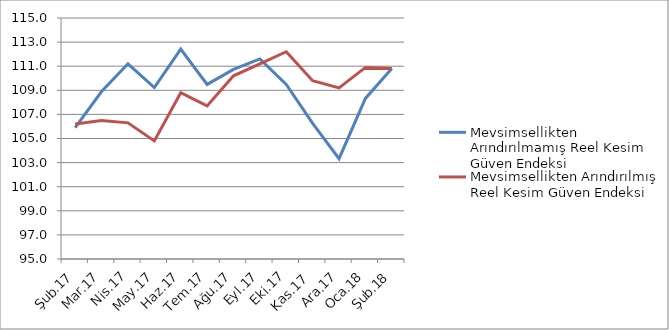
| Category | Mevsimsellikten Arındırılmamış Reel Kesim Güven Endeksi | Mevsimsellikten Arındırılmış Reel Kesim Güven Endeksi |
|---|---|---|
| Şub.17 | 105.9 | 106.2 |
| Mar.17 | 108.9 | 106.5 |
| Nis.17 | 111.2 | 106.3 |
| May.17 | 109.225 | 104.8 |
| Haz.17 | 112.412 | 108.8 |
| Tem.17 | 109.488 | 107.7 |
| Ağu.17 | 110.738 | 110.2 |
| Eyl.17 | 111.6 | 111.2 |
| Eki.17 | 109.488 | 112.2 |
| Kas.17 | 106.262 | 109.8 |
| Ara.17 | 103.325 | 109.2 |
| Oca.18 | 108.325 | 110.9 |
| Şub.18 | 110.8 | 110.8 |